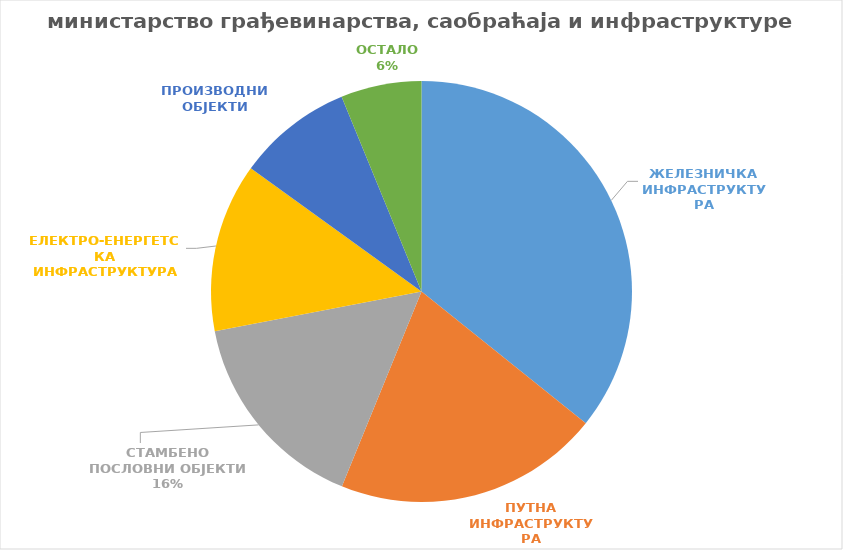
| Category | Series 0 |
|---|---|
| ЖЕЛЕЗНИЧКА ИНФРАСТРУКТУРА | 0.358 |
| ПУТНА ИНФРАСТРУКТУРА | 0.204 |
| СТАМБЕНО ПОСЛОВНИ ОБЈЕКТИ | 0.158 |
| ЕЛЕКТРО-ЕНЕРГЕТСКА ИНФРАСТРУКТУРА | 0.13 |
| ПРОИЗВОДНИ ОБЈЕКТИ | 0.089 |
| ОСТАЛО | 0.062 |